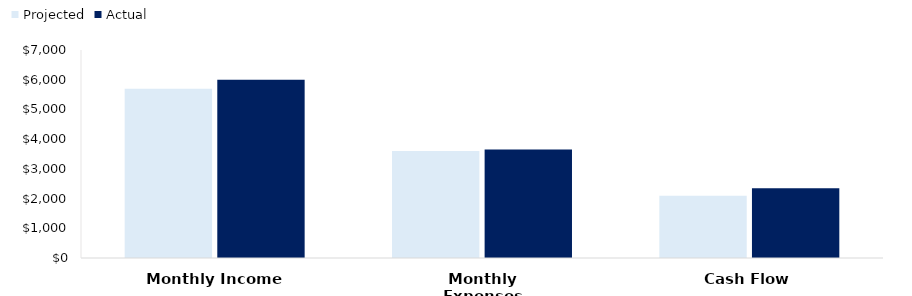
| Category | Projected | Actual |
|---|---|---|
| Monthly Income | 5700 | 6000 |
| Monthly Expenses | 3603 | 3655 |
| Cash Flow | 2097 | 2345 |